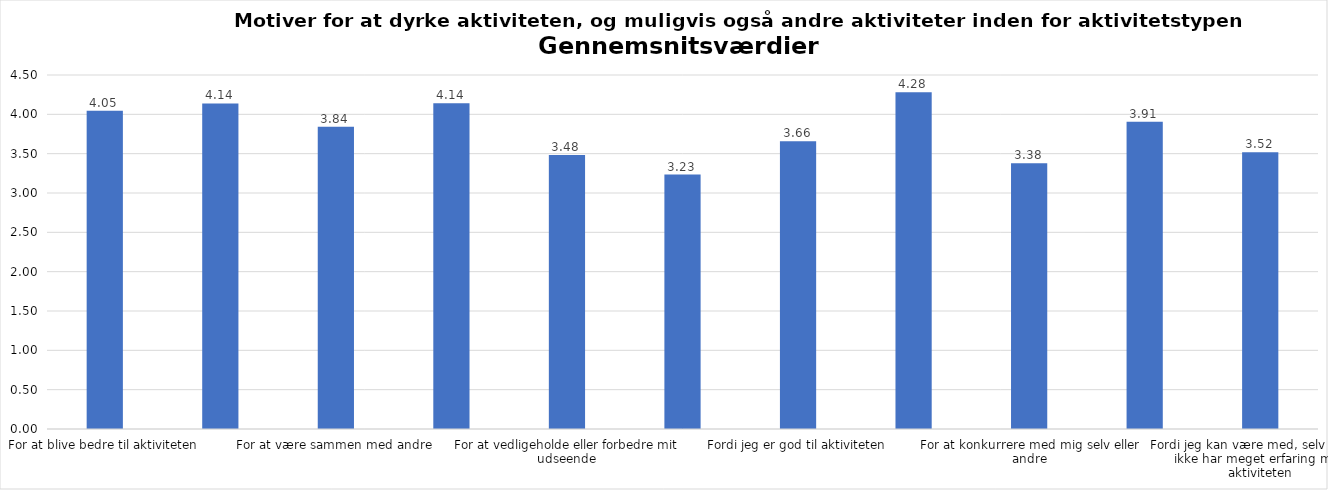
| Category | Gennemsnit |
|---|---|
| For at blive bedre til aktiviteten | 4.047 |
| For at vedligeholde eller forbedre min sundhed (fx helbred, fysisk form) | 4.139 |
| For at være sammen med andre | 3.844 |
| For at gøre noget godt for mig selv | 4.141 |
| For at vedligeholde eller forbedre mit udseende | 3.484 |
| Fordi andre i min omgangskreds opmuntrer mig til det | 3.234 |
| Fordi jeg er god til aktiviteten | 3.658 |
| Fordi jeg godt kan lide aktiviteten | 4.281 |
| For at konkurrere med mig selv eller andre | 3.377 |
| Fordi aktiviteten passer godt ind i min hverdag | 3.906 |
| Fordi jeg kan være med, selv om jeg ikke har meget erfaring med aktiviteten | 3.518 |